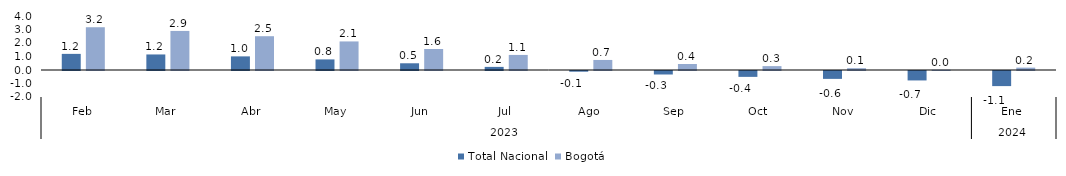
| Category | Total Nacional | Bogotá |
|---|---|---|
| 0 | 1.195 | 3.168 |
| 1 | 1.152 | 2.894 |
| 2 | 1.009 | 2.503 |
| 3 | 0.784 | 2.116 |
| 4 | 0.498 | 1.555 |
| 5 | 0.231 | 1.116 |
| 6 | -0.052 | 0.745 |
| 7 | -0.259 | 0.445 |
| 8 | -0.435 | 0.286 |
| 9 | -0.584 | 0.135 |
| 10 | -0.7 | 0.022 |
| 11 | -1.119 | 0.176 |